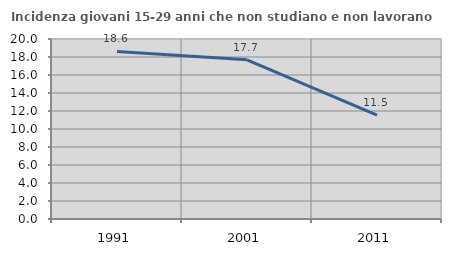
| Category | Incidenza giovani 15-29 anni che non studiano e non lavorano  |
|---|---|
| 1991.0 | 18.614 |
| 2001.0 | 17.692 |
| 2011.0 | 11.538 |